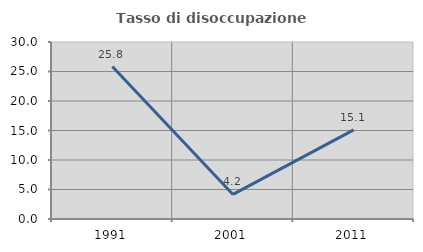
| Category | Tasso di disoccupazione giovanile  |
|---|---|
| 1991.0 | 25.843 |
| 2001.0 | 4.167 |
| 2011.0 | 15.094 |